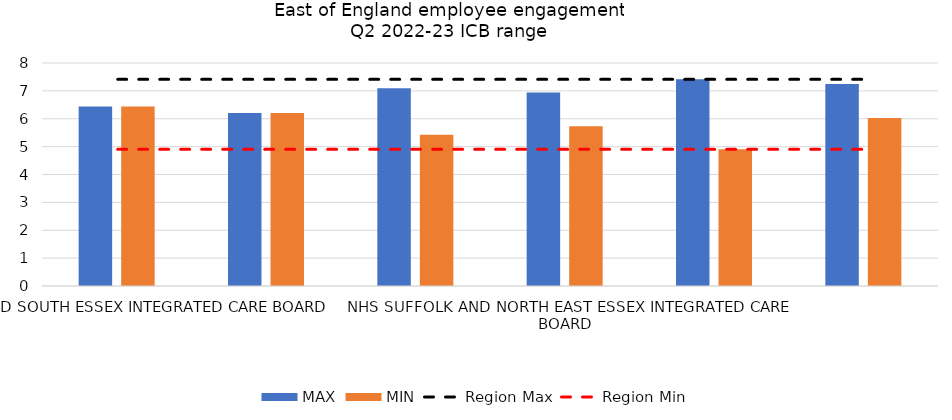
| Category | MAX | MIN |
|---|---|---|
| NHS MID AND SOUTH ESSEX INTEGRATED CARE BOARD | 6.443 | 6.443 |
| NHS BEDFORDSHIRE, LUTON AND MILTON KEYNES INTEGRATED CARE BOARD | 6.202 | 6.202 |
| NHS NORFOLK AND WAVENEY INTEGRATED CARE BOARD | 7.092 | 5.426 |
| NHS SUFFOLK AND NORTH EAST ESSEX INTEGRATED CARE BOARD | 6.946 | 5.733 |
| NHS CAMBRIDGESHIRE AND PETERBOROUGH INTEGRATED CARE BOARD | 7.413 | 4.902 |
| NHS HERTFORDSHIRE AND WEST ESSEX INTEGRATED CARE BOARD | 7.247 | 6.029 |